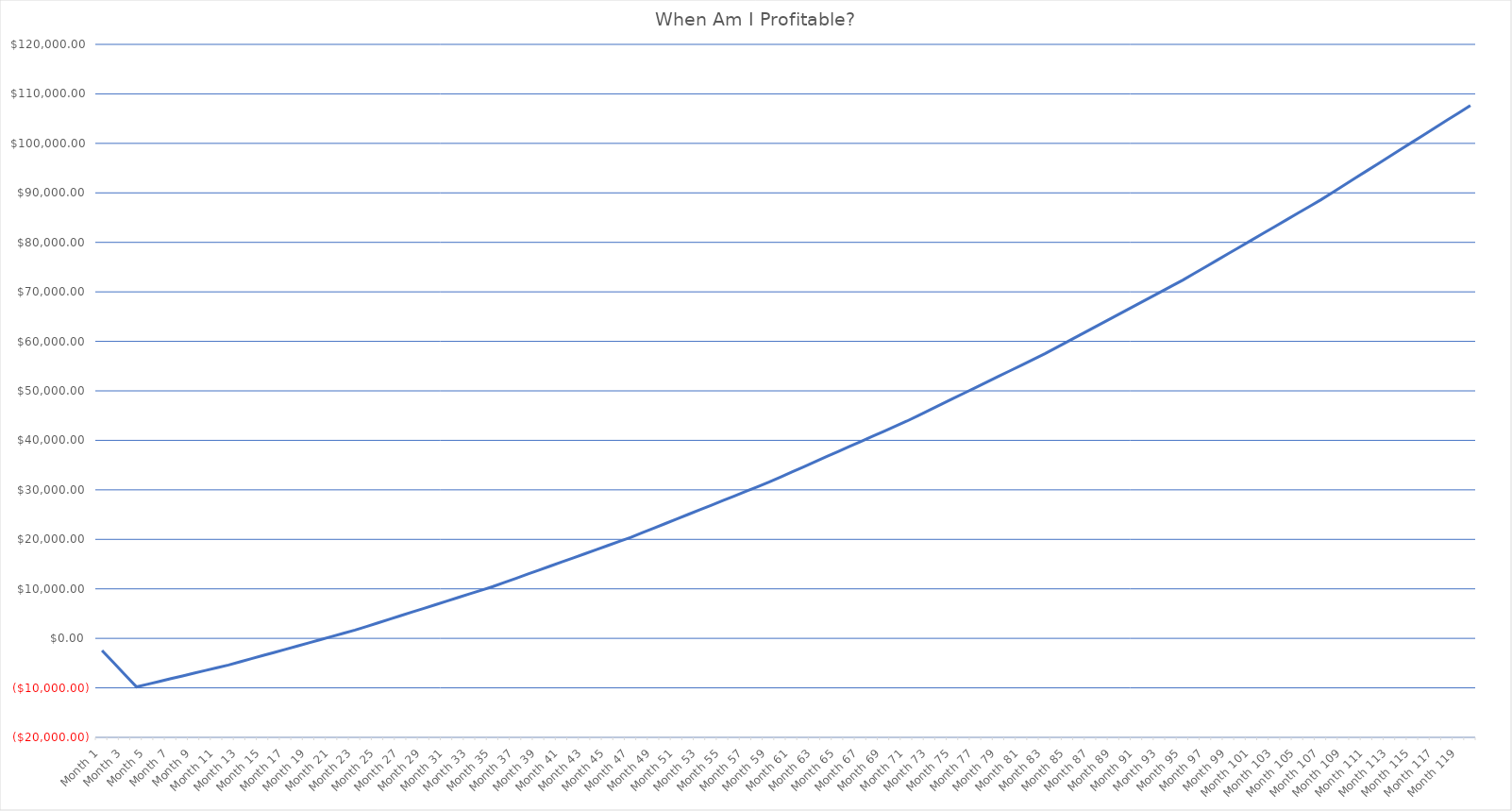
| Category | Difference |
|---|---|
| Month 1 | -2448.916 |
| Month 2 | -4897.832 |
| Month 3 | -7346.748 |
| Month 4 | -9795.665 |
| Month 5 | -9244.581 |
| Month 6 | -8693.497 |
| Month 7 | -8142.413 |
| Month 8 | -7591.329 |
| Month 9 | -7040.245 |
| Month 10 | -6489.161 |
| Month 11 | -5938.077 |
| Month 12 | -5386.994 |
| Month 13 | -4745.91 |
| Month 14 | -4104.826 |
| Month 15 | -3463.742 |
| Month 16 | -2822.658 |
| Month 17 | -2181.574 |
| Month 18 | -1540.49 |
| Month 19 | -899.407 |
| Month 20 | -258.323 |
| Month 21 | 382.761 |
| Month 22 | 1023.845 |
| Month 23 | 1664.929 |
| Month 24 | 2398.713 |
| Month 25 | 3132.497 |
| Month 26 | 3866.28 |
| Month 27 | 4600.064 |
| Month 28 | 5333.848 |
| Month 29 | 6067.632 |
| Month 30 | 6801.416 |
| Month 31 | 7535.2 |
| Month 32 | 8268.984 |
| Month 33 | 9002.768 |
| Month 34 | 9736.551 |
| Month 35 | 10470.335 |
| Month 36 | 11299.6 |
| Month 37 | 12128.865 |
| Month 38 | 12958.13 |
| Month 39 | 13787.395 |
| Month 40 | 14616.66 |
| Month 41 | 15445.924 |
| Month 42 | 16275.189 |
| Month 43 | 17104.454 |
| Month 44 | 17933.719 |
| Month 45 | 18762.984 |
| Month 46 | 19592.249 |
| Month 47 | 20421.514 |
| Month 48 | 21349.124 |
| Month 49 | 22276.734 |
| Month 50 | 23204.345 |
| Month 51 | 24131.955 |
| Month 52 | 25059.565 |
| Month 53 | 25987.175 |
| Month 54 | 26914.786 |
| Month 55 | 27842.396 |
| Month 56 | 28770.006 |
| Month 57 | 29697.617 |
| Month 58 | 30625.227 |
| Month 59 | 31552.837 |
| Month 60 | 32581.743 |
| Month 61 | 33610.649 |
| Month 62 | 34639.555 |
| Month 63 | 35668.462 |
| Month 64 | 36697.368 |
| Month 65 | 37726.274 |
| Month 66 | 38755.18 |
| Month 67 | 39784.086 |
| Month 68 | 40812.992 |
| Month 69 | 41841.898 |
| Month 70 | 42870.804 |
| Month 71 | 43899.71 |
| Month 72 | 45032.951 |
| Month 73 | 46166.192 |
| Month 74 | 47299.433 |
| Month 75 | 48432.673 |
| Month 76 | 49565.914 |
| Month 77 | 50699.155 |
| Month 78 | 51832.396 |
| Month 79 | 52965.636 |
| Month 80 | 54098.877 |
| Month 81 | 55232.118 |
| Month 82 | 56365.359 |
| Month 83 | 57498.599 |
| Month 84 | 58739.305 |
| Month 85 | 59980.01 |
| Month 86 | 61220.716 |
| Month 87 | 62461.421 |
| Month 88 | 63702.127 |
| Month 89 | 64942.832 |
| Month 90 | 66183.538 |
| Month 91 | 67424.243 |
| Month 92 | 68664.948 |
| Month 93 | 69905.654 |
| Month 94 | 71146.359 |
| Month 95 | 72387.065 |
| Month 96 | 73738.459 |
| Month 97 | 75089.853 |
| Month 98 | 76441.247 |
| Month 99 | 77792.641 |
| Month 100 | 79144.035 |
| Month 101 | 80495.43 |
| Month 102 | 81846.824 |
| Month 103 | 83198.218 |
| Month 104 | 84549.612 |
| Month 105 | 85901.006 |
| Month 106 | 87252.4 |
| Month 107 | 88603.794 |
| Month 108 | 90069.198 |
| Month 109 | 91534.601 |
| Month 110 | 93000.004 |
| Month 111 | 94465.408 |
| Month 112 | 95930.811 |
| Month 113 | 97396.215 |
| Month 114 | 98861.618 |
| Month 115 | 100327.021 |
| Month 116 | 101792.425 |
| Month 117 | 103257.828 |
| Month 118 | 104723.232 |
| Month 119 | 106188.635 |
| Month 120 | 107654.039 |